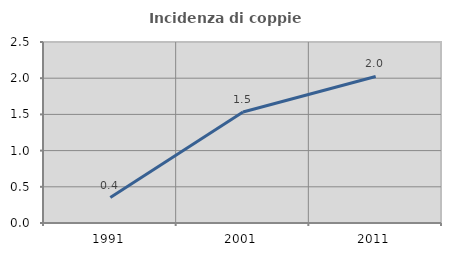
| Category | Incidenza di coppie miste |
|---|---|
| 1991.0 | 0.351 |
| 2001.0 | 1.533 |
| 2011.0 | 2.024 |